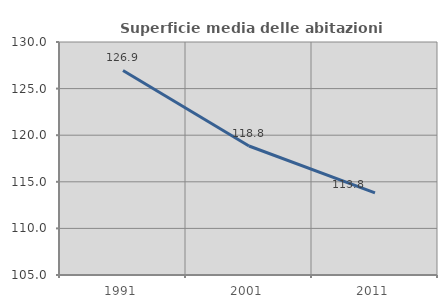
| Category | Superficie media delle abitazioni occupate |
|---|---|
| 1991.0 | 126.946 |
| 2001.0 | 118.838 |
| 2011.0 | 113.82 |